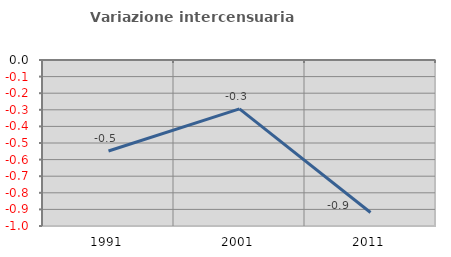
| Category | Variazione intercensuaria annua |
|---|---|
| 1991.0 | -0.549 |
| 2001.0 | -0.295 |
| 2011.0 | -0.919 |